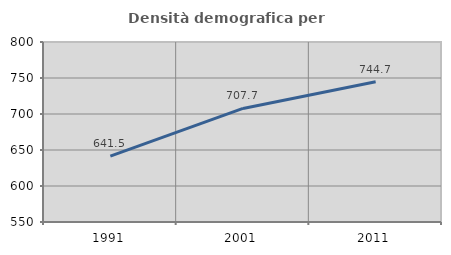
| Category | Densità demografica |
|---|---|
| 1991.0 | 641.474 |
| 2001.0 | 707.726 |
| 2011.0 | 744.69 |